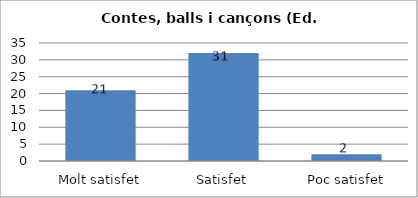
| Category | Series 0 |
|---|---|
| Molt satisfet | 21 |
| Satisfet | 32 |
| Poc satisfet | 2 |